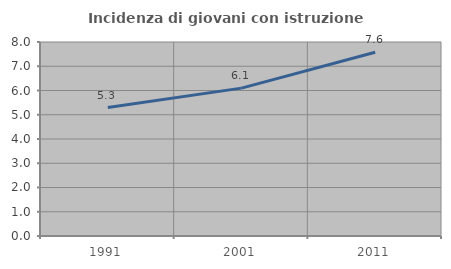
| Category | Incidenza di giovani con istruzione universitaria |
|---|---|
| 1991.0 | 5.298 |
| 2001.0 | 6.098 |
| 2011.0 | 7.576 |